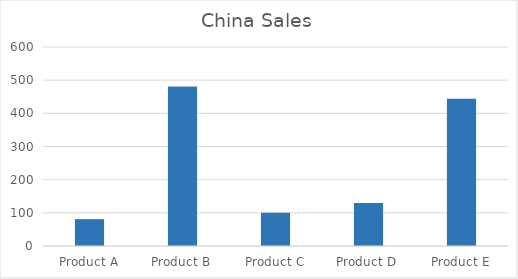
| Category | London |
|---|---|
| Product A | 81 |
| Product B | 481 |
| Product C | 100 |
| Product D | 130 |
| Product E | 444 |